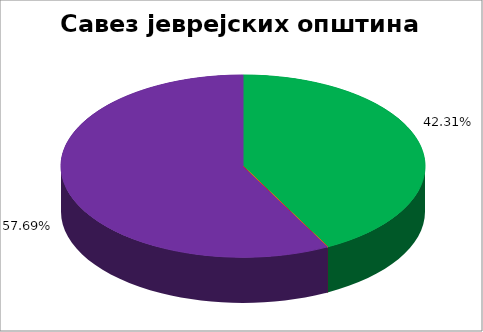
| Category | Савез јеврејских општина Србије |
|---|---|
| 0 | 0.423 |
| 1 | 0 |
| 2 | 0 |
| 3 | 0 |
| 4 | 0.577 |